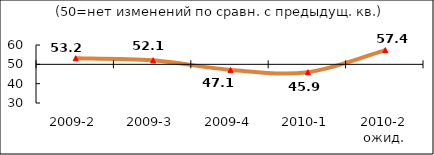
| Category | Диф.индекс ↓ |
|---|---|
| 2009-2 | 53.16 |
| 2009-3 | 52.08 |
| 2009-4 | 47.12 |
| 2010-1 | 45.905 |
| 2010-2 ожид. | 57.38 |